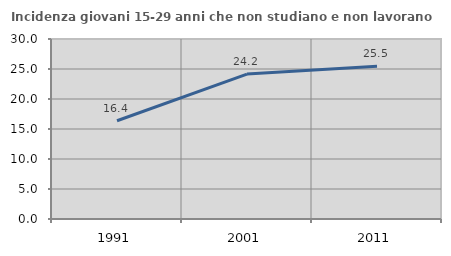
| Category | Incidenza giovani 15-29 anni che non studiano e non lavorano  |
|---|---|
| 1991.0 | 16.379 |
| 2001.0 | 24.155 |
| 2011.0 | 25.463 |